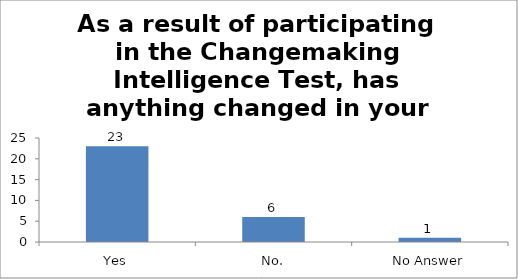
| Category | As a result of participating in the Changemaking Intelligence Test, has anything changed in your thinking or future plans? |
|---|---|
| Yes | 23 |
| No. | 6 |
| No Answer | 1 |